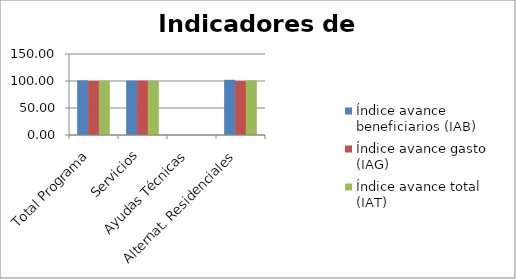
| Category | Índice avance beneficiarios (IAB)  | Índice avance gasto (IAG) | Índice avance total (IAT)  |
|---|---|---|---|
| Total Programa | 101.214 | 100.175 | 100.694 |
| Servicios | 100.834 | 100.601 | 100.718 |
| Ayudas Técnicas | 0 | 0 | 0 |
| Alternat. Residenciales | 102.226 | 99.957 | 101.092 |